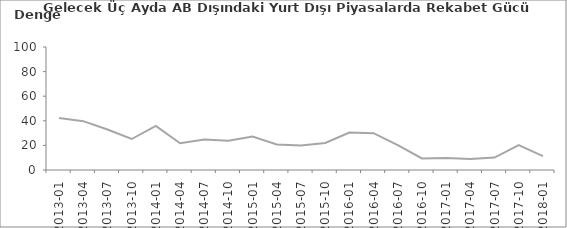
| Category | Gelecek Üç Aydaki AB Dışındaki Piyasalarda Rekabet Gücü Beklentisi |
|---|---|
| 2013-01 | 42.3 |
| 2013-04 | 39.7 |
| 2013-07 | 32.9 |
| 2013-10 | 25.2 |
| 2014-01 | 35.9 |
| 2014-04 | 21.7 |
| 2014-07 | 24.8 |
| 2014-10 | 23.7 |
| 2015-01 | 27.2 |
| 2015-04 | 20.8 |
| 2015-07 | 19.9 |
| 2015-10 | 22 |
| 2016-01 | 30.4 |
| 2016-04 | 29.9 |
| 2016-07 | 20.3 |
| 2016-10 | 9.4 |
| 2017-01 | 9.8 |
| 2017-04 | 8.9 |
| 2017-07 | 10.1 |
| 2017-10 | 20.2 |
| 2018-01 | 11.3 |